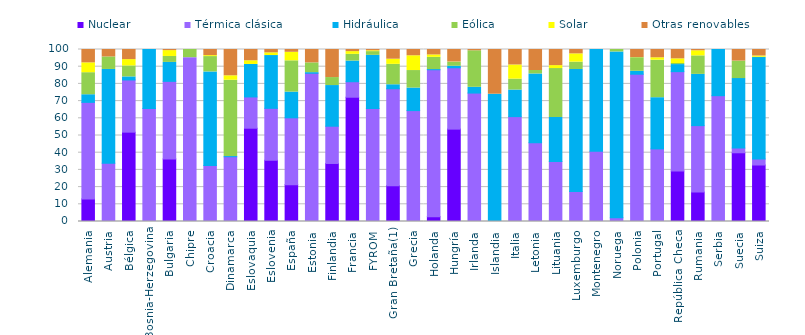
| Category | Nuclear | Térmica clásica | Hidráulica | Eólica | Solar | Otras renovables |
|---|---|---|---|---|---|---|
| Alemania | 13.129 | 56.146 | 4.422 | 12.823 | 5.72 | 7.759 |
| Austria | 0 | 33.858 | 54.538 | 7.283 | 0 | 4.321 |
| Bélgica | 51.944 | 30.344 | 1.777 | 6.372 | 3.68 | 5.883 |
| Bosnia-Herzegovina | 0 | 65.701 | 34.299 | 0 | 0 | 0 |
| Bulgaria | 36.383 | 45.102 | 11.009 | 3.457 | 3.403 | 0.646 |
| Chipre | 0 | 95.246 | 0 | 4.754 | 0 | 0 |
| Croacia | 0 | 32.525 | 54.431 | 8.933 | 0.551 | 3.561 |
| Dinamarca | 0 | 37.652 | 0.066 | 44.407 | 2.588 | 15.287 |
| Eslovaquia | 54.239 | 18.174 | 18.876 | 0.02 | 2.149 | 6.542 |
| Eslovenia | 35.601 | 30.195 | 30.687 | 0.039 | 1.542 | 1.935 |
| España | 21.399 | 38.88 | 14.942 | 18.193 | 4.968 | 1.618 |
| Estonia | 0 | 86.204 | 0.336 | 5.68 | 0.01 | 7.771 |
| Finlandia | 33.739 | 21.66 | 23.645 | 4.644 | 0 | 16.312 |
| Francia | 72.256 | 9.01 | 12.024 | 3.893 | 1.584 | 1.234 |
| FYROM | 0 | 65.685 | 30.917 | 2.173 | 0.494 | 0.731 |
| Gran Bretaña(1) | 20.845 | 56.328 | 2.33 | 11.863 | 2.998 | 5.636 |
| Grecia | 0 | 64.481 | 13.097 | 10.187 | 8.59 | 3.644 |
| Holanda | 2.816 | 85.417 | 0.091 | 7.11 | 1.404 | 3.161 |
| Hungría | 53.707 | 35.664 | 0.899 | 2.367 | 0.114 | 7.25 |
| Irlanda | 0 | 74.67 | 3.344 | 21.24 | 0 | 0.747 |
| Islandia | 0 | 0 | 73.962 | 0.05 | 0 | 25.988 |
| Italia | 0 | 60.973 | 15.453 | 6.348 | 8.233 | 8.993 |
| Letonia | 0 | 45.781 | 39.997 | 2.002 | 0 | 12.22 |
| Lituania | 0 | 34.893 | 25.56 | 28.478 | 1.711 | 9.358 |
| Luxemburgo | 0 | 17.395 | 70.992 | 4.278 | 4.795 | 2.539 |
| Montenegro | 0 | 40.87 | 59.13 | 0 | 0 | 0 |
| Noruega | 0 | 2.195 | 96.377 | 1.427 | 0 | 0 |
| Polonia | 0 | 85.638 | 1.686 | 7.907 | 0.08 | 4.689 |
| Portugal | 0 | 42.211 | 29.766 | 21.816 | 1.396 | 4.811 |
| República Checa | 29.43 | 57.697 | 4.107 | 0.631 | 2.693 | 5.442 |
| Rumania | 17.092 | 38.644 | 29.8 | 10.755 | 2.971 | 0.739 |
| Serbia | 0 | 73.147 | 26.853 | 0 | 0 | 0 |
| Suecia | 39.958 | 2.705 | 40.42 | 10.181 | 0 | 6.735 |
| Suiza | 32.839 | 3.494 | 58.956 | 0.214 | 0.73 | 3.767 |